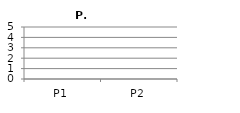
| Category | Series 6 |
|---|---|
| P1 | 0 |
| P2 | 0 |